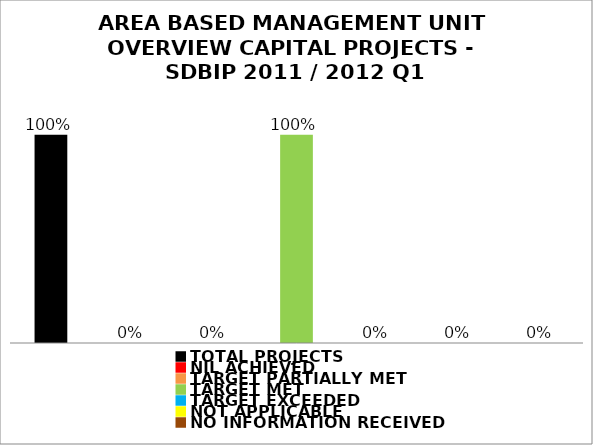
| Category | Series 1 |
|---|---|
| TOTAL PROJECTS | 1 |
| NIL ACHIEVED | 0 |
| TARGET PARTIALLY MET | 0 |
| TARGET MET | 1 |
| TARGET EXCEEDED | 0 |
| NOT APPLICABLE | 0 |
| NO INFORMATION RECEIVED | 0 |